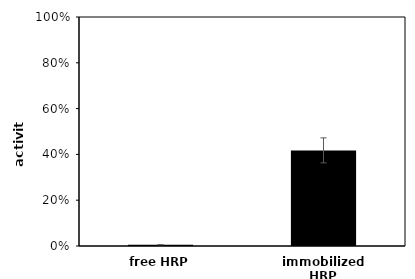
| Category | Series 0 |
|---|---|
| free HRP | 0.005 |
| immobilized HRP | 0.418 |